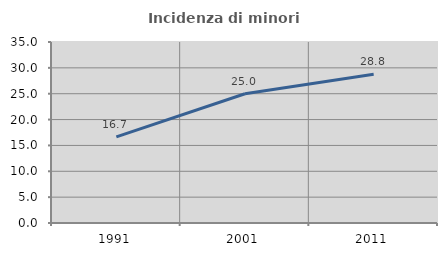
| Category | Incidenza di minori stranieri |
|---|---|
| 1991.0 | 16.667 |
| 2001.0 | 25 |
| 2011.0 | 28.777 |